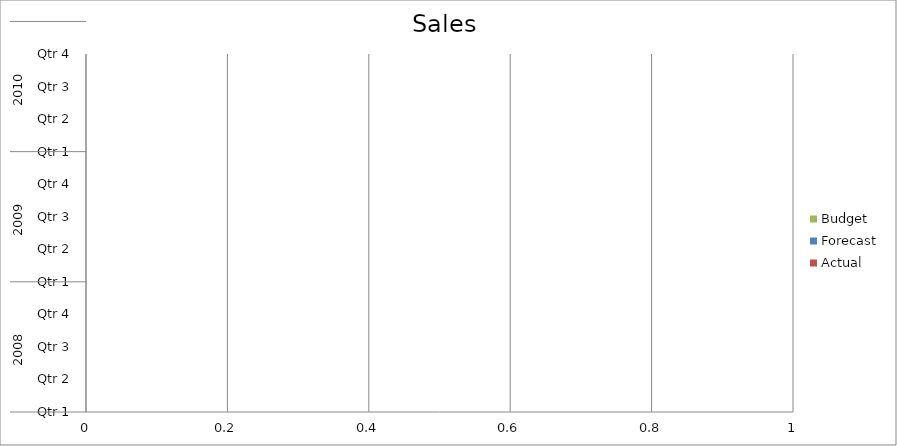
| Category | Budget | Forecast | Actual |
|---|---|---|---|
| 0 | 1550 | 1650 | 730 |
| 1 | 530 | 590 | 960 |
| 2 | 3200 | 2060 | 2200 |
| 3 | 3030 | 1440 | 650 |
| 4 | 2210 | 3180 | 1410 |
| 5 | 2740 | 1680 | 790 |
| 6 | 2480 | 1610 | 910 |
| 7 | 2310 | 1280 | 3190 |
| 8 | 2270 | 640 | 570 |
| 9 | 540 | 1700 | 1020 |
| 10 | 3380 | 2280 | 2320 |
| 11 | 1200 | 3040 | 1900 |